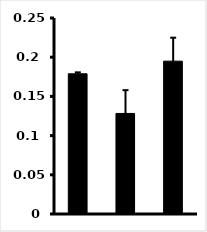
| Category | Series 0 |
|---|---|
| 0 | 0.179 |
| 1 | 0.128 |
| 2 | 0.195 |